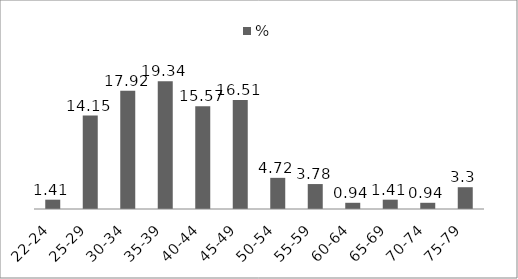
| Category | % |
|---|---|
| 22-24 | 1.41 |
| 25-29 | 14.15 |
| 30-34 | 17.92 |
| 35-39 | 19.34 |
| 40-44 | 15.57 |
| 45-49 | 16.51 |
| 50-54 | 4.72 |
| 55-59 | 3.78 |
| 60-64 | 0.94 |
| 65-69 | 1.41 |
| 70-74 | 0.94 |
| 75-79 | 3.3 |